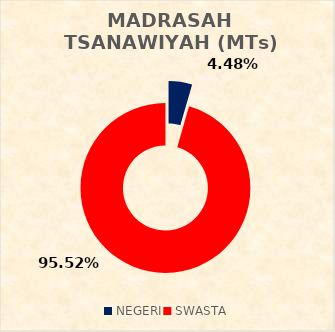
| Category | MADRASAH TSANAWIYAH (MTs) STATUS SEKOLAH |
|---|---|
| NEGERI | 6 |
| SWASTA | 128 |